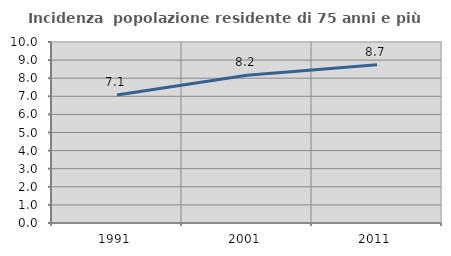
| Category | Incidenza  popolazione residente di 75 anni e più |
|---|---|
| 1991.0 | 7.07 |
| 2001.0 | 8.168 |
| 2011.0 | 8.741 |